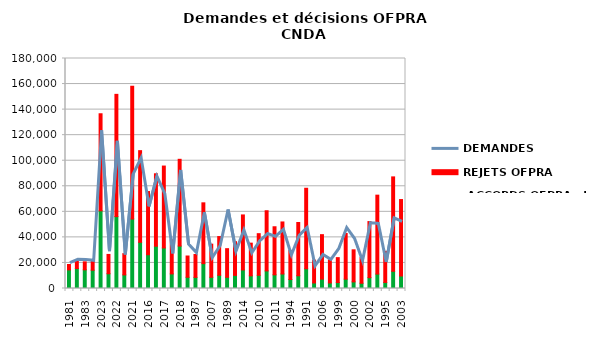
| Category |  ACCORDS OFPRA et CNDA | REJETS OFPRA  |
|---|---|---|
| 1981 | 14586 | 4181 |
| 1982 | 15670 | 5540 |
| 1983 | 14608 | 6252 |
| 1984 | 14314 | 7614 |
| 2023 | 60808 | 75943 |
| 1985 | 11539 | 15123 |
| 2022 | 56276 | 95665 |
| 1986 | 10645 | 16629 |
| 2021 | 54479 | 103891 |
| 2019 | 36139 | 71738 |
| 2016 | 26428 | 49447 |
| 2020 | 33101 | 56673 |
| 2017 | 31734 | 64092 |
| 2008 | 11441 | 26648 |
| 2018 | 33216 | 67891 |
| 1988 | 8794 | 16631 |
| 1987 | 8704 | 17924 |
| 2015 | 19450 | 47597 |
| 2007 | 8781 | 25922 |
| 2009 | 10373 | 30283 |
| 1989 | 8770 | 22400 |
| 1992 | 10266 | 26380 |
| 2014 | 14512 | 43066 |
| 1993 | 9914 | 25575 |
| 2010 | 10340 | 32571 |
| 2005 | 13770 | 47088 |
| 2011 | 10702 | 37619 |
| 2013 | 11371 | 40706 |
| 1994 | 7025 | 22685 |
| 2012 | 9976 | 41672 |
| 1991 | 15467 | 62975 |
| 1996 | 4344 | 17859 |
| 2006 | 7354 | 34786 |
| 1998 | 4342 | 18063 |
| 1999 | 4659 | 19492 |
| 2001 | 7323 | 35730 |
| 2000 | 5185 | 25093 |
| 1997 | 4112 | 20055 |
| 2002 | 8495 | 43880 |
| 2004 | 11292 | 61760 |
| 1995 | 4742 | 24354 |
| 1990 | 13486 | 73866 |
| 2003 | 9790 | 59818 |